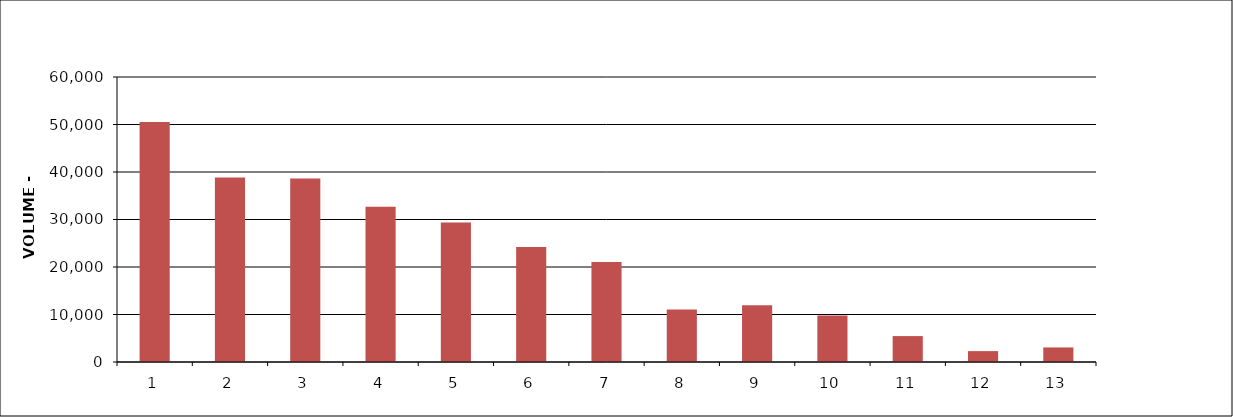
| Category | Series 1 |
|---|---|
| 0 | 50505 |
| 1 | 38843 |
| 2 | 38613 |
| 3 | 32699 |
| 4 | 29345 |
| 5 | 24227 |
| 6 | 21074 |
| 7 | 11030 |
| 8 | 11928 |
| 9 | 9779 |
| 10 | 5456 |
| 11 | 2293 |
| 12 | 3067 |